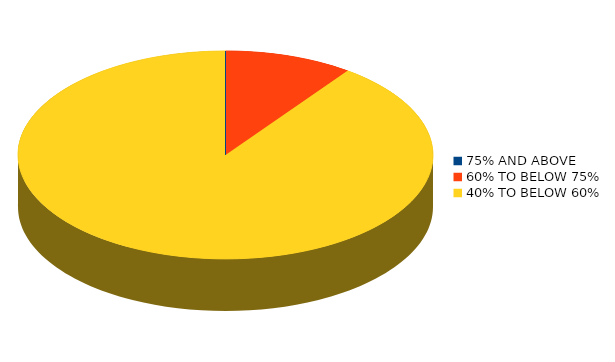
| Category | Number of students |
|---|---|
| 75% AND ABOVE | 0 |
| 60% TO BELOW 75% | 1 |
| 40% TO BELOW 60% | 9 |